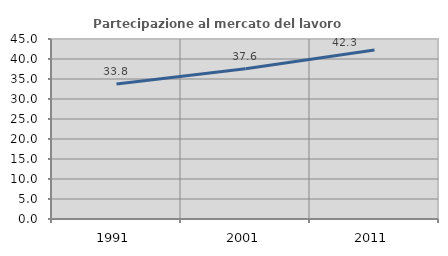
| Category | Partecipazione al mercato del lavoro  femminile |
|---|---|
| 1991.0 | 33.756 |
| 2001.0 | 37.564 |
| 2011.0 | 42.253 |